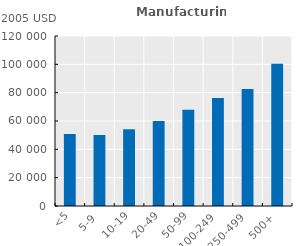
| Category | Series 0 |
|---|---|
| <5 | 50888.926 |
| 5-9 | 50034.16 |
| 10-19 | 54160.711 |
| 20-49 | 59972.695 |
| 50-99 | 67902.016 |
| 100-249 | 76263.695 |
| 250-499 | 82528.914 |
| 500+ | 100471.602 |